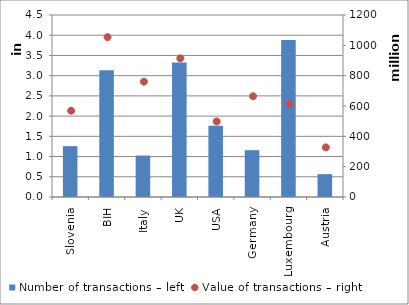
| Category | Number of transactions – left |
|---|---|
| Slovenia | 1256939 |
| BIH | 3131197 |
| Italy | 1023846 |
| UK | 3322725 |
| USA | 1759143 |
| Germany | 1157558 |
| Luxembourg | 3881945 |
| Austria | 565030 |